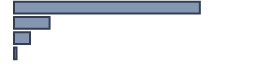
| Category | Percentatge |
|---|---|
| 0 | 77.435 |
| 1 | 14.826 |
| 2 | 6.696 |
| 3 | 1.043 |